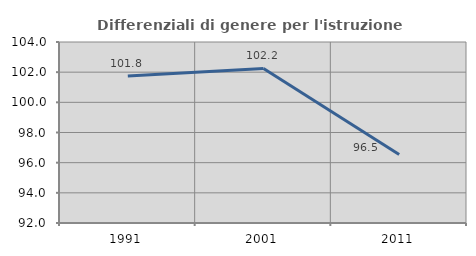
| Category | Differenziali di genere per l'istruzione superiore |
|---|---|
| 1991.0 | 101.753 |
| 2001.0 | 102.245 |
| 2011.0 | 96.54 |